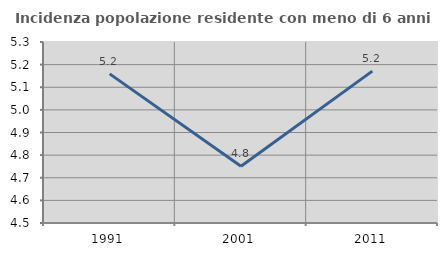
| Category | Incidenza popolazione residente con meno di 6 anni |
|---|---|
| 1991.0 | 5.159 |
| 2001.0 | 4.751 |
| 2011.0 | 5.171 |